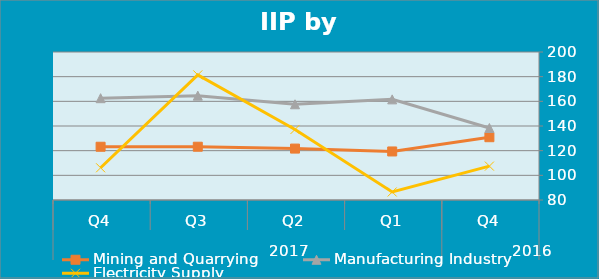
| Category | Mining and Quarrying | Manufacturing Industry | Electricity Supply |
|---|---|---|---|
| 0 | 130.91 | 138.37 | 107.49 |
| 1 | 119.36 | 161.6 | 86.5 |
| 2 | 121.69 | 157.62 | 137.2 |
| 3 | 123.2 | 164.6 | 181.44 |
| 4 | 123.18 | 162.54 | 106.12 |